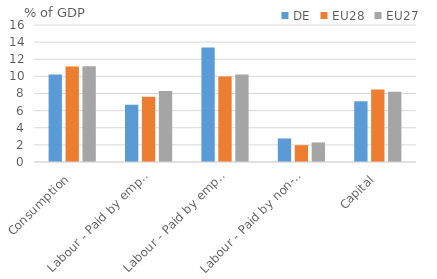
| Category | DE | EU28 | EU27 |
|---|---|---|---|
| Consumption | 10.22 | 11.162 | 11.186 |
| Labour - Paid by employers | 6.692 | 7.618 | 8.281 |
| Labour - Paid by employees | 13.368 | 9.997 | 10.231 |
| Labour - Paid by non-employed | 2.752 | 1.966 | 2.281 |
| Capital | 7.091 | 8.473 | 8.218 |